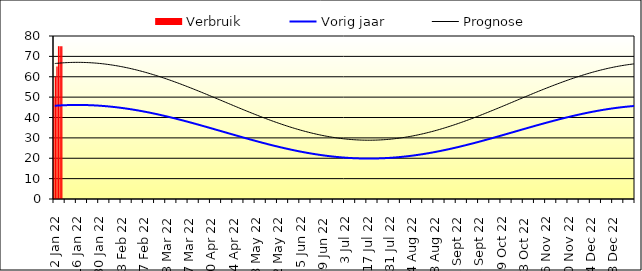
| Category | Verbruik |
|---|---|
| 2022-01-02 | 50 |
| 2022-01-03 | 60 |
| 2022-01-04 | 65 |
| 2022-01-05 | 75 |
| 2022-01-06 | 75 |
| 2022-01-07 | 75 |
| 2022-01-08 | 0 |
| 2022-01-09 | 0 |
| 2022-01-10 | 0 |
| 2022-01-11 | 0 |
| 2022-01-12 | 0 |
| 2022-01-13 | 0 |
| 2022-01-14 | 0 |
| 2022-01-15 | 0 |
| 2022-01-16 | 0 |
| 2022-01-17 | 0 |
| 2022-01-18 | 0 |
| 2022-01-19 | 0 |
| 2022-01-20 | 0 |
| 2022-01-21 | 0 |
| 2022-01-22 | 0 |
| 2022-01-23 | 0 |
| 2022-01-24 | 0 |
| 2022-01-25 | 0 |
| 2022-01-26 | 0 |
| 2022-01-27 | 0 |
| 2022-01-28 | 0 |
| 2022-01-29 | 0 |
| 2022-01-30 | 0 |
| 2022-01-31 | 0 |
| 2022-02-01 | 0 |
| 2022-02-02 | 0 |
| 2022-02-03 | 0 |
| 2022-02-04 | 0 |
| 2022-02-05 | 0 |
| 2022-02-06 | 0 |
| 2022-02-07 | 0 |
| 2022-02-08 | 0 |
| 2022-02-09 | 0 |
| 2022-02-10 | 0 |
| 2022-02-11 | 0 |
| 2022-02-12 | 0 |
| 2022-02-13 | 0 |
| 2022-02-14 | 0 |
| 2022-02-15 | 0 |
| 2022-02-16 | 0 |
| 2022-02-17 | 0 |
| 2022-02-18 | 0 |
| 2022-02-19 | 0 |
| 2022-02-20 | 0 |
| 2022-02-21 | 0 |
| 2022-02-22 | 0 |
| 2022-02-23 | 0 |
| 2022-02-24 | 0 |
| 2022-02-25 | 0 |
| 2022-02-26 | 0 |
| 2022-02-27 | 0 |
| 2022-02-28 | 0 |
| 2022-03-01 | 0 |
| 2022-03-02 | 0 |
| 2022-03-03 | 0 |
| 2022-03-04 | 0 |
| 2022-03-05 | 0 |
| 2022-03-06 | 0 |
| 2022-03-07 | 0 |
| 2022-03-08 | 0 |
| 2022-03-09 | 0 |
| 2022-03-10 | 0 |
| 2022-03-11 | 0 |
| 2022-03-12 | 0 |
| 2022-03-13 | 0 |
| 2022-03-14 | 0 |
| 2022-03-15 | 0 |
| 2022-03-16 | 0 |
| 2022-03-17 | 0 |
| 2022-03-18 | 0 |
| 2022-03-19 | 0 |
| 2022-03-20 | 0 |
| 2022-03-21 | 0 |
| 2022-03-22 | 0 |
| 2022-03-23 | 0 |
| 2022-03-24 | 0 |
| 2022-03-25 | 0 |
| 2022-03-26 | 0 |
| 2022-03-27 | 0 |
| 2022-03-28 | 0 |
| 2022-03-29 | 0 |
| 2022-03-30 | 0 |
| 2022-03-31 | 0 |
| 2022-04-01 | 0 |
| 2022-04-02 | 0 |
| 2022-04-03 | 0 |
| 2022-04-04 | 0 |
| 2022-04-05 | 0 |
| 2022-04-06 | 0 |
| 2022-04-07 | 0 |
| 2022-04-08 | 0 |
| 2022-04-09 | 0 |
| 2022-04-10 | 0 |
| 2022-04-11 | 0 |
| 2022-04-12 | 0 |
| 2022-04-13 | 0 |
| 2022-04-14 | 0 |
| 2022-04-15 | 0 |
| 2022-04-16 | 0 |
| 2022-04-17 | 0 |
| 2022-04-18 | 0 |
| 2022-04-19 | 0 |
| 2022-04-20 | 0 |
| 2022-04-21 | 0 |
| 2022-04-22 | 0 |
| 2022-04-23 | 0 |
| 2022-04-24 | 0 |
| 2022-04-25 | 0 |
| 2022-04-26 | 0 |
| 2022-04-27 | 0 |
| 2022-04-28 | 0 |
| 2022-04-29 | 0 |
| 2022-04-30 | 0 |
| 2022-05-01 | 0 |
| 2022-05-02 | 0 |
| 2022-05-03 | 0 |
| 2022-05-04 | 0 |
| 2022-05-05 | 0 |
| 2022-05-06 | 0 |
| 2022-05-07 | 0 |
| 2022-05-08 | 0 |
| 2022-05-09 | 0 |
| 2022-05-10 | 0 |
| 2022-05-11 | 0 |
| 2022-05-12 | 0 |
| 2022-05-13 | 0 |
| 2022-05-14 | 0 |
| 2022-05-15 | 0 |
| 2022-05-16 | 0 |
| 2022-05-17 | 0 |
| 2022-05-18 | 0 |
| 2022-05-19 | 0 |
| 2022-05-20 | 0 |
| 2022-05-21 | 0 |
| 2022-05-22 | 0 |
| 2022-05-23 | 0 |
| 2022-05-24 | 0 |
| 2022-05-25 | 0 |
| 2022-05-26 | 0 |
| 2022-05-27 | 0 |
| 2022-05-28 | 0 |
| 2022-05-29 | 0 |
| 2022-05-30 | 0 |
| 2022-05-31 | 0 |
| 2022-06-01 | 0 |
| 2022-06-02 | 0 |
| 2022-06-03 | 0 |
| 2022-06-04 | 0 |
| 2022-06-05 | 0 |
| 2022-06-06 | 0 |
| 2022-06-07 | 0 |
| 2022-06-08 | 0 |
| 2022-06-09 | 0 |
| 2022-06-10 | 0 |
| 2022-06-11 | 0 |
| 2022-06-12 | 0 |
| 2022-06-13 | 0 |
| 2022-06-14 | 0 |
| 2022-06-15 | 0 |
| 2022-06-16 | 0 |
| 2022-06-17 | 0 |
| 2022-06-18 | 0 |
| 2022-06-19 | 0 |
| 2022-06-20 | 0 |
| 2022-06-21 | 0 |
| 2022-06-22 | 0 |
| 2022-06-23 | 0 |
| 2022-06-24 | 0 |
| 2022-06-25 | 0 |
| 2022-06-26 | 0 |
| 2022-06-27 | 0 |
| 2022-06-28 | 0 |
| 2022-06-29 | 0 |
| 2022-06-30 | 0 |
| 2022-07-01 | 0 |
| 2022-07-02 | 0 |
| 2022-07-03 | 0 |
| 2022-07-04 | 0 |
| 2022-07-05 | 0 |
| 2022-07-06 | 0 |
| 2022-07-07 | 0 |
| 2022-07-08 | 0 |
| 2022-07-09 | 0 |
| 2022-07-10 | 0 |
| 2022-07-11 | 0 |
| 2022-07-12 | 0 |
| 2022-07-13 | 0 |
| 2022-07-14 | 0 |
| 2022-07-15 | 0 |
| 2022-07-16 | 0 |
| 2022-07-17 | 0 |
| 2022-07-18 | 0 |
| 2022-07-19 | 0 |
| 2022-07-20 | 0 |
| 2022-07-21 | 0 |
| 2022-07-22 | 0 |
| 2022-07-23 | 0 |
| 2022-07-24 | 0 |
| 2022-07-25 | 0 |
| 2022-07-26 | 0 |
| 2022-07-27 | 0 |
| 2022-07-28 | 0 |
| 2022-07-29 | 0 |
| 2022-07-30 | 0 |
| 2022-07-31 | 0 |
| 2022-08-01 | 0 |
| 2022-08-02 | 0 |
| 2022-08-03 | 0 |
| 2022-08-04 | 0 |
| 2022-08-05 | 0 |
| 2022-08-06 | 0 |
| 2022-08-07 | 0 |
| 2022-08-08 | 0 |
| 2022-08-09 | 0 |
| 2022-08-10 | 0 |
| 2022-08-11 | 0 |
| 2022-08-12 | 0 |
| 2022-08-13 | 0 |
| 2022-08-14 | 0 |
| 2022-08-15 | 0 |
| 2022-08-16 | 0 |
| 2022-08-17 | 0 |
| 2022-08-18 | 0 |
| 2022-08-19 | 0 |
| 2022-08-20 | 0 |
| 2022-08-21 | 0 |
| 2022-08-22 | 0 |
| 2022-08-23 | 0 |
| 2022-08-24 | 0 |
| 2022-08-25 | 0 |
| 2022-08-26 | 0 |
| 2022-08-27 | 0 |
| 2022-08-28 | 0 |
| 2022-08-29 | 0 |
| 2022-08-30 | 0 |
| 2022-08-31 | 0 |
| 2022-09-01 | 0 |
| 2022-09-02 | 0 |
| 2022-09-03 | 0 |
| 2022-09-04 | 0 |
| 2022-09-05 | 0 |
| 2022-09-06 | 0 |
| 2022-09-07 | 0 |
| 2022-09-08 | 0 |
| 2022-09-09 | 0 |
| 2022-09-10 | 0 |
| 2022-09-11 | 0 |
| 2022-09-12 | 0 |
| 2022-09-13 | 0 |
| 2022-09-14 | 0 |
| 2022-09-15 | 0 |
| 2022-09-16 | 0 |
| 2022-09-17 | 0 |
| 2022-09-18 | 0 |
| 2022-09-19 | 0 |
| 2022-09-20 | 0 |
| 2022-09-21 | 0 |
| 2022-09-22 | 0 |
| 2022-09-23 | 0 |
| 2022-09-24 | 0 |
| 2022-09-25 | 0 |
| 2022-09-26 | 0 |
| 2022-09-27 | 0 |
| 2022-09-28 | 0 |
| 2022-09-29 | 0 |
| 2022-09-30 | 0 |
| 2022-10-01 | 0 |
| 2022-10-02 | 0 |
| 2022-10-03 | 0 |
| 2022-10-04 | 0 |
| 2022-10-05 | 0 |
| 2022-10-06 | 0 |
| 2022-10-07 | 0 |
| 2022-10-08 | 0 |
| 2022-10-09 | 0 |
| 2022-10-10 | 0 |
| 2022-10-11 | 0 |
| 2022-10-12 | 0 |
| 2022-10-13 | 0 |
| 2022-10-14 | 0 |
| 2022-10-15 | 0 |
| 2022-10-16 | 0 |
| 2022-10-17 | 0 |
| 2022-10-18 | 0 |
| 2022-10-19 | 0 |
| 2022-10-20 | 0 |
| 2022-10-21 | 0 |
| 2022-10-22 | 0 |
| 2022-10-23 | 0 |
| 2022-10-24 | 0 |
| 2022-10-25 | 0 |
| 2022-10-26 | 0 |
| 2022-10-27 | 0 |
| 2022-10-28 | 0 |
| 2022-10-29 | 0 |
| 2022-10-30 | 0 |
| 2022-10-31 | 0 |
| 2022-11-01 | 0 |
| 2022-11-02 | 0 |
| 2022-11-03 | 0 |
| 2022-11-04 | 0 |
| 2022-11-05 | 0 |
| 2022-11-06 | 0 |
| 2022-11-07 | 0 |
| 2022-11-08 | 0 |
| 2022-11-09 | 0 |
| 2022-11-10 | 0 |
| 2022-11-11 | 0 |
| 2022-11-12 | 0 |
| 2022-11-13 | 0 |
| 2022-11-14 | 0 |
| 2022-11-15 | 0 |
| 2022-11-16 | 0 |
| 2022-11-17 | 0 |
| 2022-11-18 | 0 |
| 2022-11-19 | 0 |
| 2022-11-20 | 0 |
| 2022-11-21 | 0 |
| 2022-11-22 | 0 |
| 2022-11-23 | 0 |
| 2022-11-24 | 0 |
| 2022-11-25 | 0 |
| 2022-11-26 | 0 |
| 2022-11-27 | 0 |
| 2022-11-28 | 0 |
| 2022-11-29 | 0 |
| 2022-11-30 | 0 |
| 2022-12-01 | 0 |
| 2022-12-02 | 0 |
| 2022-12-03 | 0 |
| 2022-12-04 | 0 |
| 2022-12-05 | 0 |
| 2022-12-06 | 0 |
| 2022-12-07 | 0 |
| 2022-12-08 | 0 |
| 2022-12-09 | 0 |
| 2022-12-10 | 0 |
| 2022-12-11 | 0 |
| 2022-12-12 | 0 |
| 2022-12-13 | 0 |
| 2022-12-14 | 0 |
| 2022-12-15 | 0 |
| 2022-12-16 | 0 |
| 2022-12-17 | 0 |
| 2022-12-18 | 0 |
| 2022-12-19 | 0 |
| 2022-12-20 | 0 |
| 2022-12-21 | 0 |
| 2022-12-22 | 0 |
| 2022-12-23 | 0 |
| 2022-12-24 | 0 |
| 2022-12-25 | 0 |
| 2022-12-26 | 0 |
| 2022-12-27 | 0 |
| 2022-12-28 | 0 |
| 2022-12-29 | 0 |
| 2022-12-30 | 0 |
| 2022-12-31 | 0 |